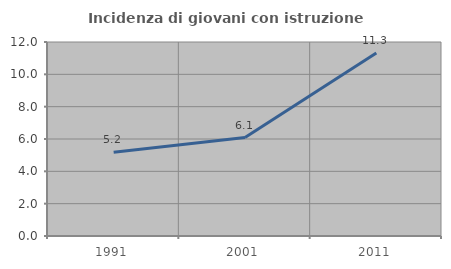
| Category | Incidenza di giovani con istruzione universitaria |
|---|---|
| 1991.0 | 5.185 |
| 2001.0 | 6.087 |
| 2011.0 | 11.321 |